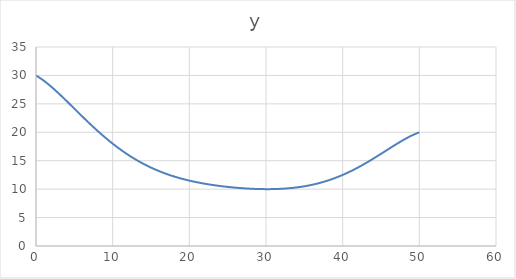
| Category | y |
|---|---|
| 0.0 | 30 |
| 1.0 | 29.097 |
| 2.0 | 28.005 |
| 3.0 | 26.785 |
| 4.0 | 25.489 |
| 5.0 | 24.16 |
| 6.0 | 22.832 |
| 7.0 | 21.533 |
| 8.0 | 20.285 |
| 9.0 | 19.104 |
| 10.0 | 18 |
| 11.0 | 16.981 |
| 12.0 | 16.052 |
| 13.0 | 15.211 |
| 14.0 | 14.458 |
| 15.0 | 13.789 |
| 16.0 | 13.199 |
| 17.0 | 12.682 |
| 18.0 | 12.231 |
| 19.0 | 11.839 |
| 20.0 | 11.5 |
| 21.0 | 11.207 |
| 22.0 | 10.955 |
| 23.0 | 10.737 |
| 24.0 | 10.551 |
| 25.0 | 10.393 |
| 26.0 | 10.262 |
| 27.0 | 10.155 |
| 28.0 | 10.075 |
| 29.0 | 10.022 |
| 30.0 | 10 |
| 31.0 | 10.012 |
| 32.0 | 10.062 |
| 33.0 | 10.157 |
| 34.0 | 10.301 |
| 35.0 | 10.5 |
| 36.0 | 10.76 |
| 37.0 | 11.087 |
| 38.0 | 11.484 |
| 39.0 | 11.955 |
| 40.0 | 12.5 |
| 41.0 | 13.119 |
| 42.0 | 13.809 |
| 43.0 | 14.561 |
| 44.0 | 15.366 |
| 45.0 | 16.207 |
| 46.0 | 17.064 |
| 47.0 | 17.909 |
| 48.0 | 18.709 |
| 49.0 | 19.423 |
| 50.0 | 20 |